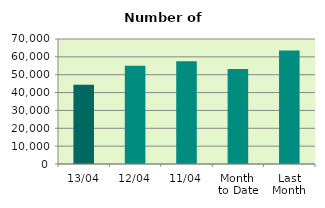
| Category | Series 0 |
|---|---|
| 13/04 | 44350 |
| 12/04 | 55034 |
| 11/04 | 57488 |
| Month 
to Date | 53222.571 |
| Last
Month | 63497.391 |